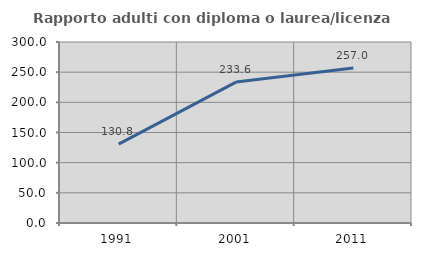
| Category | Rapporto adulti con diploma o laurea/licenza media  |
|---|---|
| 1991.0 | 130.822 |
| 2001.0 | 233.571 |
| 2011.0 | 257.031 |